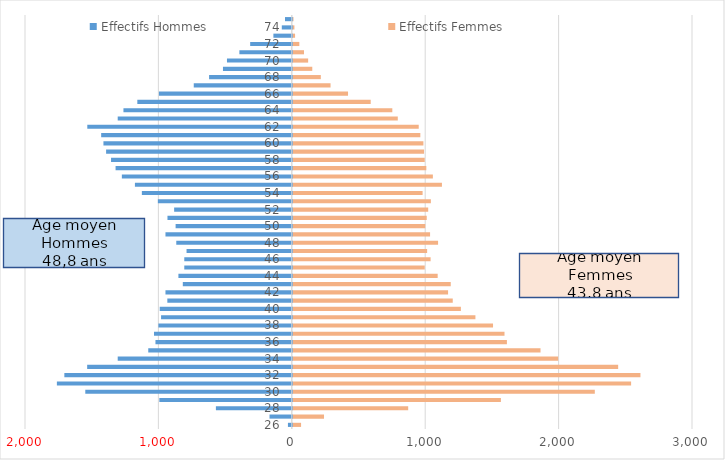
| Category | Effectifs Femmes | Effectifs Hommes |
|---|---|---|
| 26.0 | 62 | -29 |
| 27.0 | 234 | -167 |
| 28.0 | 865 | -569 |
| 29.0 | 1560 | -993 |
| 30.0 | 2264 | -1548 |
| 31.0 | 2536 | -1761 |
| 32.0 | 2606 | -1705 |
| 33.0 | 2439 | -1534 |
| 34.0 | 1989 | -1305 |
| 35.0 | 1857 | -1076 |
| 36.0 | 1605 | -1022 |
| 37.0 | 1587 | -1033 |
| 38.0 | 1501 | -1000 |
| 39.0 | 1369 | -980 |
| 40.0 | 1260 | -990 |
| 41.0 | 1199 | -933 |
| 42.0 | 1164 | -947 |
| 43.0 | 1184 | -817 |
| 44.0 | 1086 | -850 |
| 45.0 | 989 | -806 |
| 46.0 | 1033 | -806 |
| 47.0 | 1007 | -789 |
| 48.0 | 1089 | -866 |
| 49.0 | 1029 | -947 |
| 50.0 | 993 | -871 |
| 51.0 | 1004 | -932 |
| 52.0 | 1015 | -882 |
| 53.0 | 1035 | -1004 |
| 54.0 | 973 | -1124 |
| 55.0 | 1118 | -1176 |
| 56.0 | 1050 | -1274 |
| 57.0 | 1001 | -1321 |
| 58.0 | 989 | -1355 |
| 59.0 | 984 | -1392 |
| 60.0 | 979 | -1412 |
| 61.0 | 956 | -1429 |
| 62.0 | 944 | -1533 |
| 63.0 | 787 | -1305 |
| 64.0 | 746 | -1262 |
| 65.0 | 584 | -1158 |
| 66.0 | 414 | -996 |
| 67.0 | 283 | -735 |
| 68.0 | 210 | -620 |
| 69.0 | 146 | -516 |
| 70.0 | 115 | -486 |
| 71.0 | 84 | -393 |
| 72.0 | 49 | -312 |
| 73.0 | 17 | -138 |
| 74.0 | 12 | -75 |
| 75.0 | 5 | -51 |